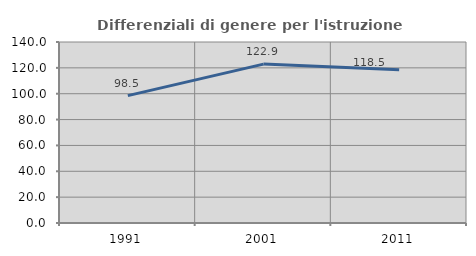
| Category | Differenziali di genere per l'istruzione superiore |
|---|---|
| 1991.0 | 98.545 |
| 2001.0 | 122.892 |
| 2011.0 | 118.453 |